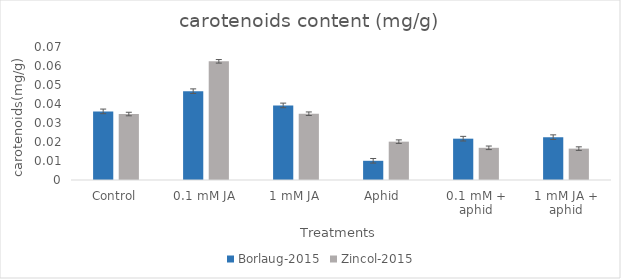
| Category | Borlaug-2015 | Zincol-2015 |
|---|---|---|
| Control | 0.036 | 0.035 |
| 0.1 mM JA | 0.047 | 0.062 |
| 1 mM JA | 0.039 | 0.035 |
| Aphid  | 0.01 | 0.02 |
| 0.1 mM + aphid | 0.022 | 0.017 |
| 1 mM JA + aphid | 0.023 | 0.017 |